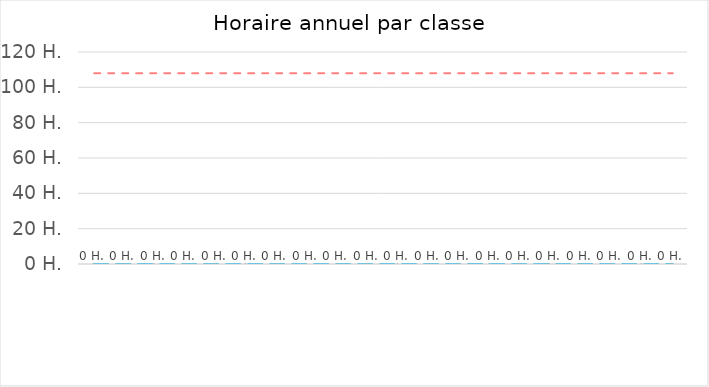
| Category | Horaire
annuel |
|---|---|
|  | 0 |
|  | 0 |
|  | 0 |
|  | 0 |
|  | 0 |
|  | 0 |
|  | 0 |
|  | 0 |
|  | 0 |
|  | 0 |
|  | 0 |
|  | 0 |
|  | 0 |
|  | 0 |
|  | 0 |
|  | 0 |
|  | 0 |
|  | 0 |
|  | 0 |
|  | 0 |